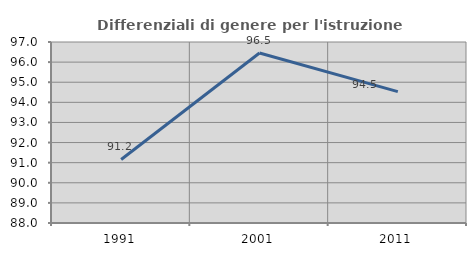
| Category | Differenziali di genere per l'istruzione superiore |
|---|---|
| 1991.0 | 91.158 |
| 2001.0 | 96.451 |
| 2011.0 | 94.53 |